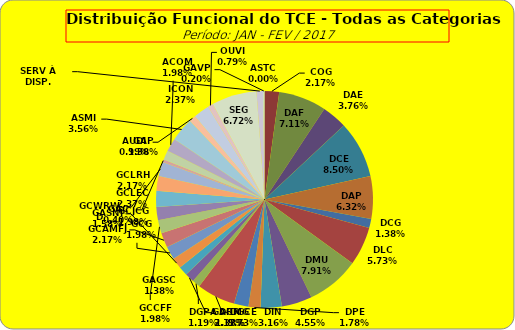
| Category | ASTC |
|---|---|
| ASTC | 0 |
| COG | 11 |
| DAF | 36 |
| DAE | 19 |
| DCE | 43 |
| DAP | 32 |
| DCG | 7 |
| DLC | 29 |
| DMU | 40 |
| DGP | 23 |
| DIN | 16 |
| DPE | 9 |
| DRR | 11 |
| DGCE | 29 |
| DGPA | 6 |
| GACMG | 7 |
| GAGSC | 7 |
| GASNI | 8 |
| GCG | 10 |
| GCAMFJ | 11 |
| GCCFF | 10 |
| GCJCG | 10 |
| GCLEC | 12 |
| GCLRH | 11 |
| GCWRWD | 11 |
| GAC | 2 |
| GAP | 7 |
| ACOM | 10 |
| ASMI | 18 |
| AUDI | 5 |
| ICON | 12 |
| OUVI | 4 |
| SEG | 34 |
| SERV À DISP. | 5 |
| GAVP | 1 |